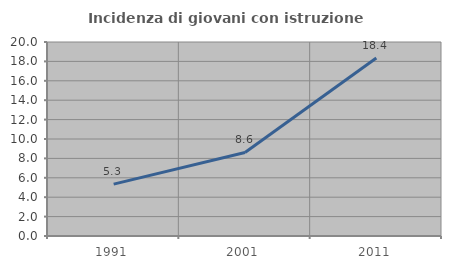
| Category | Incidenza di giovani con istruzione universitaria |
|---|---|
| 1991.0 | 5.349 |
| 2001.0 | 8.609 |
| 2011.0 | 18.359 |